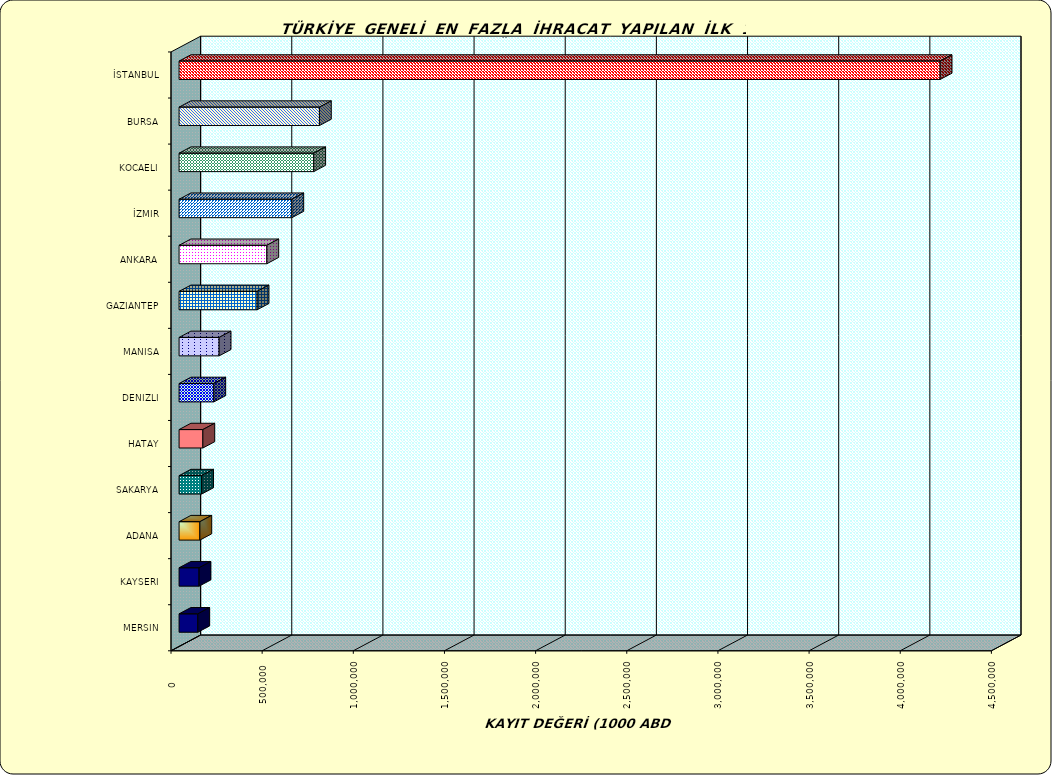
| Category | Series 0 |
|---|---|
| İSTANBUL | 4174648.052 |
| BURSA | 769927.511 |
| KOCAELI | 738647.586 |
| İZMIR | 618477.954 |
| ANKARA | 481394.735 |
| GAZIANTEP | 428000.7 |
| MANISA | 219804.793 |
| DENIZLI | 190564.173 |
| HATAY | 130521.286 |
| SAKARYA | 123799.407 |
| ADANA | 114057.869 |
| KAYSERI | 109555.3 |
| MERSIN | 102838.949 |